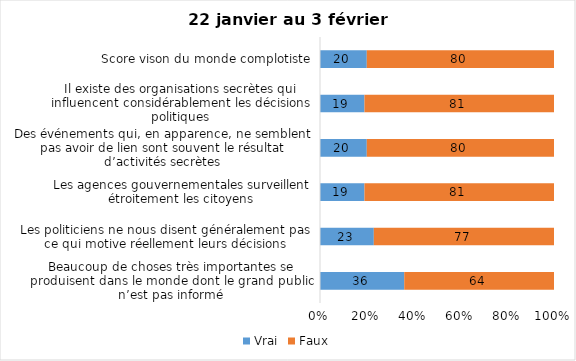
| Category | Vrai | Faux |
|---|---|---|
| Beaucoup de choses très importantes se produisent dans le monde dont le grand public n’est pas informé | 36 | 64 |
| Les politiciens ne nous disent généralement pas ce qui motive réellement leurs décisions | 23 | 77 |
| Les agences gouvernementales surveillent étroitement les citoyens | 19 | 81 |
| Des événements qui, en apparence, ne semblent pas avoir de lien sont souvent le résultat d’activités secrètes | 20 | 80 |
| Il existe des organisations secrètes qui influencent considérablement les décisions politiques | 19 | 81 |
| Score vison du monde complotiste | 20 | 80 |